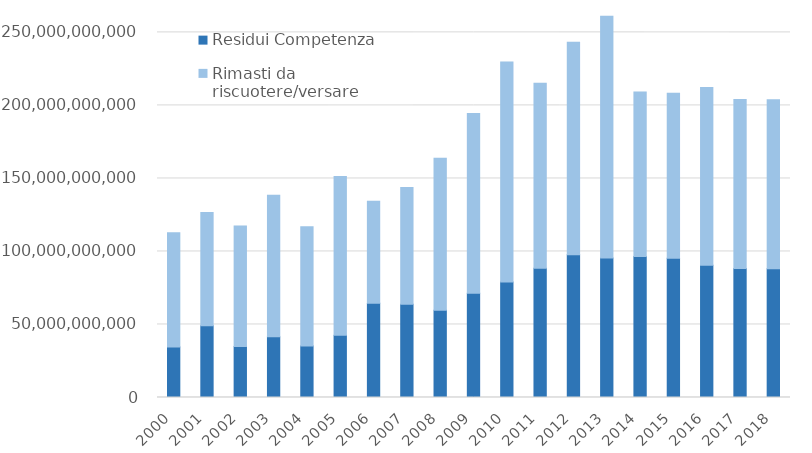
| Category | Residui Competenza | Rimasti da riscuotere/versare |
|---|---|---|
| 2000.0 | 34622000000 | 78241000000 |
| 2001.0 | 49078000000 | 77645000000 |
| 2002.0 | 34859000000 | 82558000000 |
| 2003.0 | 41541000000 | 97010000000 |
| 2004.0 | 35336000000 | 81520000000 |
| 2005.0 | 42585000000 | 108663000000 |
| 2006.0 | 64493000000 | 69956000000 |
| 2007.0 | 63839000000 | 80040000000 |
| 2008.0 | 59774000000 | 104078000000 |
| 2009.0 | 71339000000 | 123212000000 |
| 2010.0 | 79027000000 | 150763000000 |
| 2011.0 | 88501177224.53 | 126705683786.92 |
| 2012.0 | 97722496035.36 | 145555133496.4 |
| 2013.0 | 95474967421.77 | 165648754557.97 |
| 2014.0 | 96564619074.06 | 112561805601.2 |
| 2015.0 | 95352231735.89 | 112907310816.49 |
| 2016.0 | 90634161431.03 | 121603863303.76 |
| 2017.0 | 88262733034.44 | 115813040456.62 |
| 2018.0 | 88099784764.28 | 115839933548 |